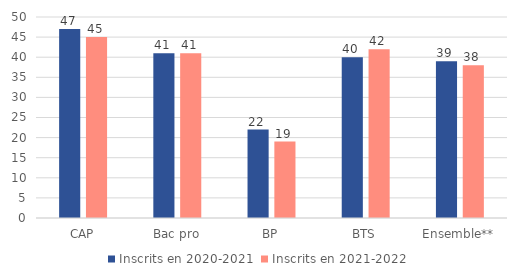
| Category | Inscrits en 2020-2021 | Inscrits en 2021-2022 |
|---|---|---|
| CAP | 47 | 45 |
| Bac pro | 41 | 41 |
| BP | 22 | 19 |
| BTS | 40 | 42 |
| Ensemble** | 39 | 38 |